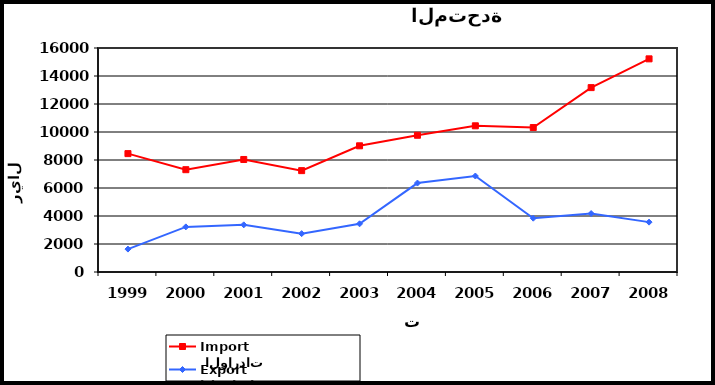
| Category |  الواردات           Import | الصادرات          Export |
|---|---|---|
| 1999.0 | 8456 | 1637 |
| 2000.0 | 7308 | 3223 |
| 2001.0 | 8037 | 3369 |
| 2002.0 | 7240 | 2740 |
| 2003.0 | 9014 | 3443 |
| 2004.0 | 9767 | 6353 |
| 2005.0 | 10443 | 6855 |
| 2006.0 | 10318 | 3843 |
| 2007.0 | 13170 | 4175 |
| 2008.0 | 15225 | 3562 |